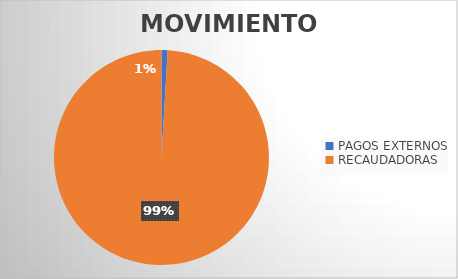
| Category | MOVIMIENTOS |
|---|---|
| PAGOS EXTERNOS | 169 |
| RECAUDADORAS | 18211 |